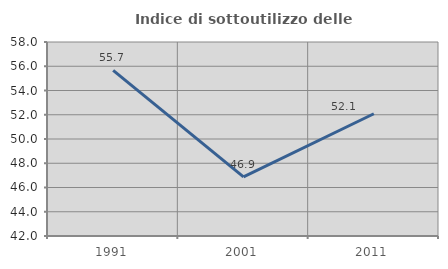
| Category | Indice di sottoutilizzo delle abitazioni  |
|---|---|
| 1991.0 | 55.657 |
| 2001.0 | 46.875 |
| 2011.0 | 52.083 |